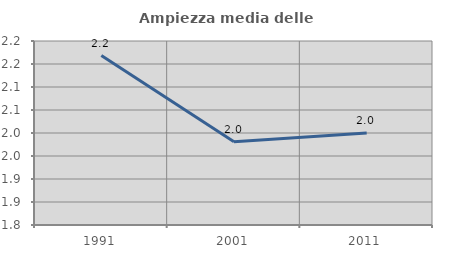
| Category | Ampiezza media delle famiglie |
|---|---|
| 1991.0 | 2.168 |
| 2001.0 | 1.981 |
| 2011.0 | 2 |